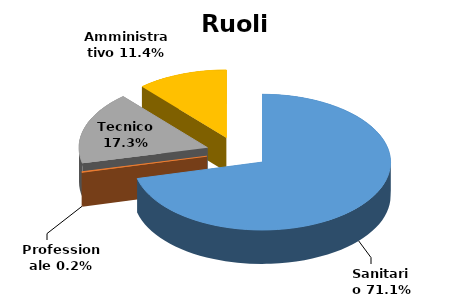
| Category | Series 0 |
|---|---|
| Sanitario | 0.711 |
| Professionale | 0.002 |
| Tecnico | 0.173 |
| Amministrativo | 0.114 |